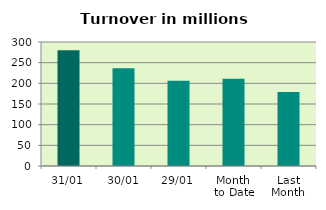
| Category | Series 0 |
|---|---|
| 31/01 | 280.01 |
| 30/01 | 236.465 |
| 29/01 | 206.394 |
| Month 
to Date | 211.344 |
| Last
Month | 179.047 |